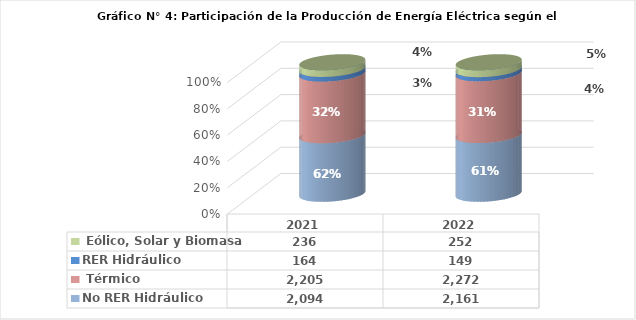
| Category | No RER | RER |
|---|---|---|
| 2021.0 | 2204.562 | 236.347 |
| 2022.0 | 2272.468 | 251.838 |